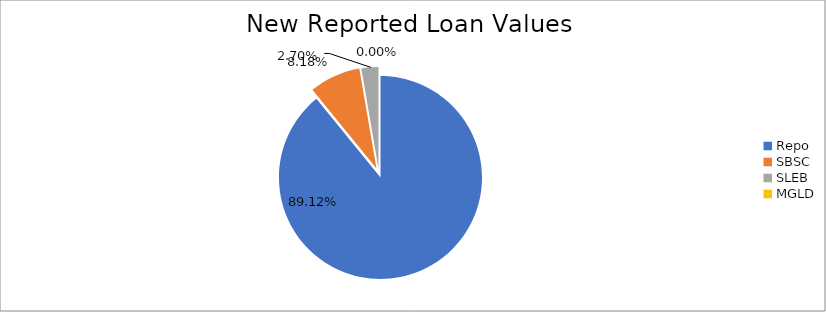
| Category | Series 0 |
|---|---|
| Repo | 11934414.459 |
| SBSC | 1094769.155 |
| SLEB | 362025.035 |
| MGLD | 170.048 |